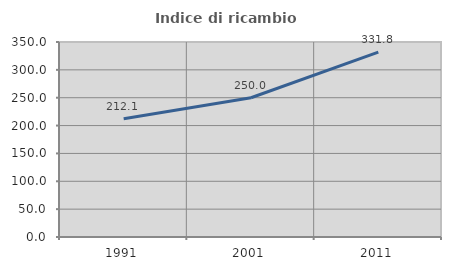
| Category | Indice di ricambio occupazionale  |
|---|---|
| 1991.0 | 212.121 |
| 2001.0 | 250 |
| 2011.0 | 331.818 |